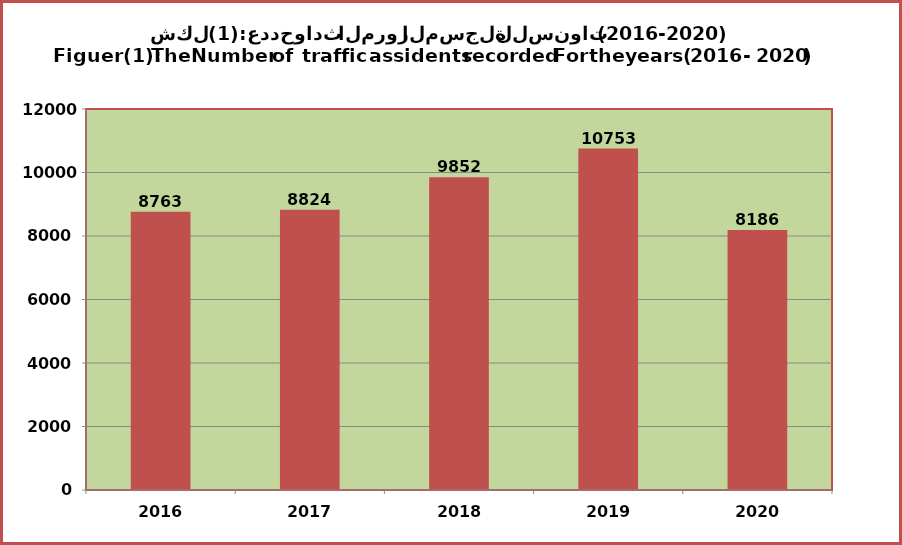
| Category | Series 1 |
|---|---|
| 2016.0 | 8763 |
| 2017.0 | 8824 |
| 2018.0 | 9852 |
| 2019.0 | 10753 |
| 2020.0 | 8186 |